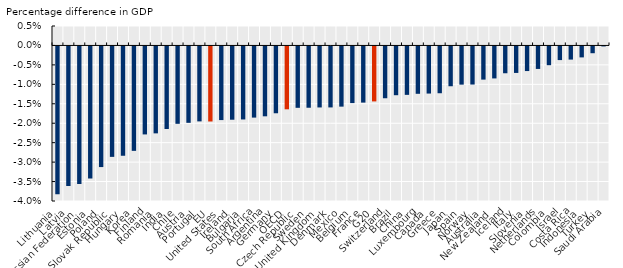
| Category | Percentage difference in GDP due to diseases caused by drinking above the 1 and 1½  drinks/day threshold |
|---|---|
| Lithuania | -0.038 |
| Latvia | -0.036 |
| Russian Federation | -0.035 |
| Estonia | -0.034 |
| Poland | -0.031 |
| Slovak Republic | -0.028 |
| Hungary | -0.028 |
| Korea | -0.027 |
| Finland | -0.023 |
| Romania | -0.022 |
| India | -0.021 |
| Chile | -0.02 |
| Austria | -0.02 |
| Portugal | -0.019 |
| EU | -0.019 |
| United States | -0.019 |
| Ireland | -0.019 |
| Bulgaria | -0.019 |
| South Africa | -0.018 |
| Argentina | -0.018 |
| Germany | -0.017 |
| OECD | -0.016 |
| Czech Republic | -0.016 |
| Sweden | -0.016 |
| United Kingdom | -0.016 |
| Denmark | -0.016 |
| Mexico | -0.015 |
| Belgium | -0.015 |
| France | -0.014 |
| G20 | -0.014 |
| Switzerland | -0.013 |
| Brazil | -0.013 |
| China | -0.012 |
| Luxembourg | -0.012 |
| Canada | -0.012 |
| Greece | -0.012 |
| Japan | -0.01 |
| Spain | -0.01 |
| Norway | -0.01 |
| Australia | -0.009 |
| New Zealand | -0.008 |
| Iceland | -0.007 |
| Italy | -0.007 |
| Slovenia | -0.006 |
| Netherlands | -0.006 |
| Colombia | -0.005 |
| Israel | -0.004 |
| Costa Rica | -0.003 |
| Indonesia | -0.003 |
| Turkey | -0.002 |
| Saudi Arabia | 0 |